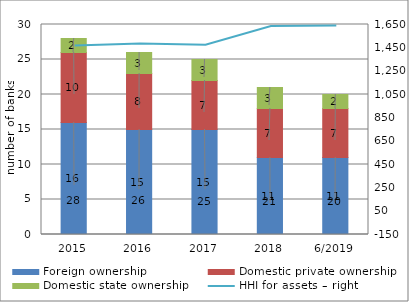
| Category | Foreign ownership | Domestic private ownership | Domestic state ownership |
|---|---|---|---|
| 2015 | 16 | 10 | 2 |
| 2016 | 15 | 8 | 3 |
| 2017 | 15 | 7 | 3 |
| 2018 | 11 | 7 | 3 |
| 6/2019 | 11 | 7 | 2 |